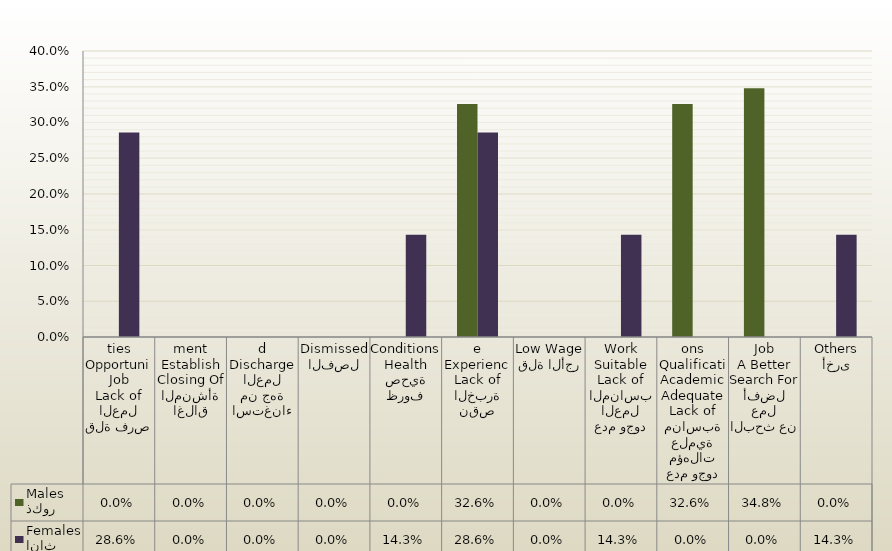
| Category | ذكور
Males | اناث
Females |
|---|---|---|
| قلة فرص العمل
Lack of Job Opportunities | 0 | 0.286 |
| اغلاق المنشأة
Closing Of Establishment | 0 | 0 |
| استغناء من جهة العمل
Discharged | 0 | 0 |
| الفصل
Dismissed | 0 | 0 |
| ظروف صحية
Health Conditions | 0 | 0.143 |
| نقص الخبرة
Lack of Experience | 0.326 | 0.286 |
| قلة الأجر
Low Wage | 0 | 0 |
| عدم وجود العمل المناسب
Lack of Suitable Work | 0 | 0.143 |
| عدم وجود مؤهلات علمية مناسبة
Lack of Adequate Academic Qualifications | 0.326 | 0 |
| البحث عن عمل أفضل
Search For A Better Job | 0.348 | 0 |
| أخرى
Others | 0 | 0.143 |